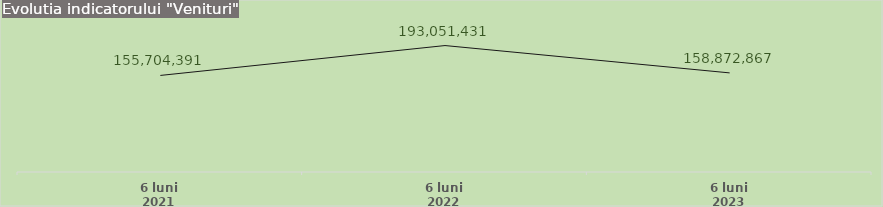
| Category | Series 1 |
|---|---|
| 6 luni 2021 | 155704391 |
| 6 luni 2022 | 193051430.641 |
| 6 luni 2023 | 158872866.675 |